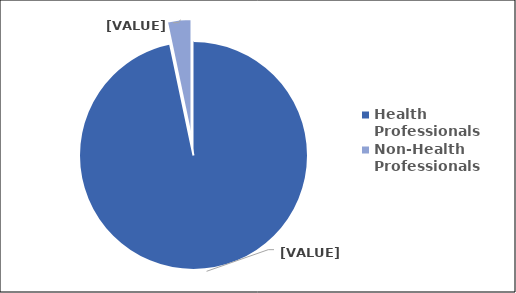
| Category | Series 0 |
|---|---|
| Health Professionals | 96.705 |
| Non-Health Professionals | 3.295 |